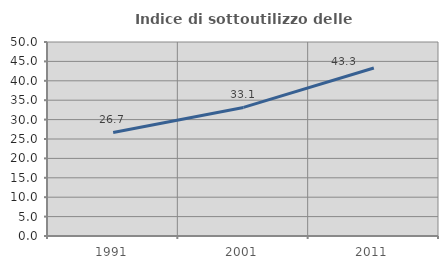
| Category | Indice di sottoutilizzo delle abitazioni  |
|---|---|
| 1991.0 | 26.677 |
| 2001.0 | 33.136 |
| 2011.0 | 43.29 |